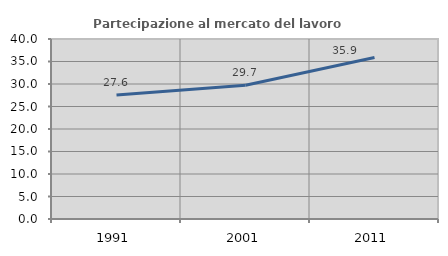
| Category | Partecipazione al mercato del lavoro  femminile |
|---|---|
| 1991.0 | 27.559 |
| 2001.0 | 29.73 |
| 2011.0 | 35.87 |